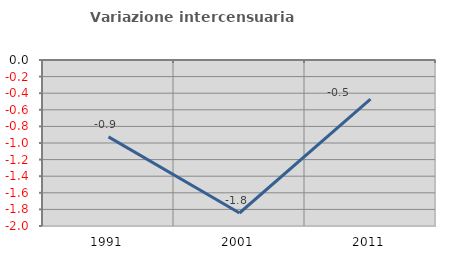
| Category | Variazione intercensuaria annua |
|---|---|
| 1991.0 | -0.926 |
| 2001.0 | -1.843 |
| 2011.0 | -0.472 |